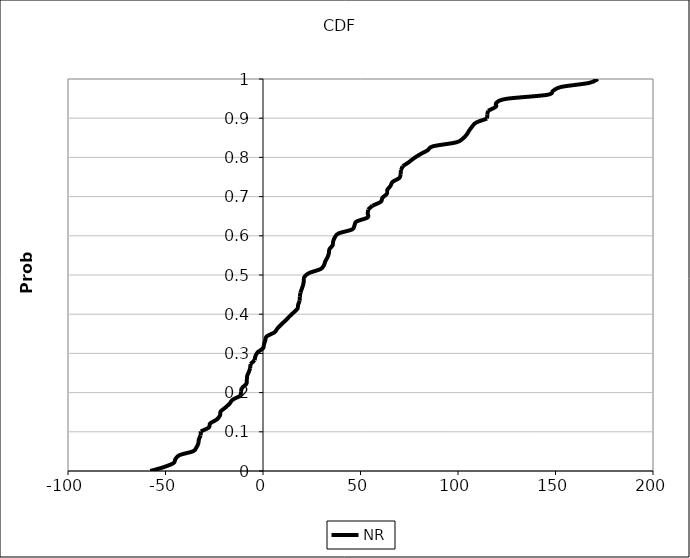
| Category | NR |
|---|---|
| -57.80231670845163 | 0 |
| -50.768704256658864 | 0.01 |
| -45.89005395207772 | 0.02 |
| -44.88699912563922 | 0.03 |
| -42.83760416756681 | 0.04 |
| -35.80107690244833 | 0.051 |
| -34.08795415145099 | 0.061 |
| -33.170313349035865 | 0.071 |
| -32.85676496140718 | 0.081 |
| -31.988054647058533 | 0.091 |
| -31.883796508712237 | 0.101 |
| -27.750935825503973 | 0.111 |
| -27.137139278713533 | 0.121 |
| -23.71871902504344 | 0.131 |
| -22.068456627165858 | 0.141 |
| -21.735996351500575 | 0.152 |
| -19.344555364196253 | 0.162 |
| -17.164370383557582 | 0.172 |
| -15.556686673689995 | 0.182 |
| -11.400345725125732 | 0.192 |
| -11.31280791130169 | 0.202 |
| -10.899704788500202 | 0.212 |
| -8.53740838362745 | 0.222 |
| -8.292044710777418 | 0.232 |
| -8.113612582367608 | 0.242 |
| -7.2853473468984475 | 0.253 |
| -6.534444747934344 | 0.263 |
| -6.428352315279767 | 0.273 |
| -4.2700662670837914 | 0.283 |
| -3.8866024050823 | 0.293 |
| -2.7022717595641836 | 0.303 |
| 0.013833679676281463 | 0.313 |
| 0.5207084772946473 | 0.323 |
| 1.1881976500699807 | 0.333 |
| 1.8792577445975667 | 0.343 |
| 5.843211174480388 | 0.354 |
| 7.407280895870855 | 0.364 |
| 9.324636957407648 | 0.374 |
| 11.544540646224448 | 0.384 |
| 13.498674381363656 | 0.394 |
| 15.642389859038502 | 0.404 |
| 17.675558598504608 | 0.414 |
| 18.023532332826164 | 0.424 |
| 18.840865235881836 | 0.434 |
| 18.89000572064299 | 0.444 |
| 19.172988759238933 | 0.455 |
| 19.88846547085575 | 0.465 |
| 20.58690533154771 | 0.475 |
| 20.930464330371763 | 0.485 |
| 21.19040562594327 | 0.495 |
| 23.620346942738735 | 0.505 |
| 29.542655897615333 | 0.515 |
| 31.260731827544674 | 0.525 |
| 31.984115072558126 | 0.535 |
| 33.093347683887345 | 0.545 |
| 33.77400788845452 | 0.556 |
| 34.06235298112847 | 0.566 |
| 35.680472831147085 | 0.576 |
| 35.99322262365982 | 0.586 |
| 36.835186557173074 | 0.596 |
| 38.72121885121328 | 0.606 |
| 45.69311638877963 | 0.616 |
| 46.90935505974943 | 0.626 |
| 47.92549956508816 | 0.636 |
| 53.53956777104699 | 0.646 |
| 53.73485746920065 | 0.657 |
| 53.84152552611755 | 0.667 |
| 56.08965080527997 | 0.677 |
| 60.42864812842154 | 0.687 |
| 61.24733836996106 | 0.697 |
| 63.49993588082555 | 0.707 |
| 63.75868305517926 | 0.717 |
| 65.37262262503685 | 0.727 |
| 66.4080860071389 | 0.737 |
| 69.89299357189188 | 0.747 |
| 70.61318461264887 | 0.758 |
| 70.74520972334395 | 0.768 |
| 71.69926628259395 | 0.778 |
| 74.80496344937404 | 0.788 |
| 77.43016224654679 | 0.798 |
| 80.65933589609452 | 0.808 |
| 84.42828966593731 | 0.818 |
| 87.12332937960812 | 0.828 |
| 99.10400128542682 | 0.838 |
| 102.60053683759088 | 0.848 |
| 104.50650048216235 | 0.859 |
| 105.74930778693826 | 0.869 |
| 107.26988353642074 | 0.879 |
| 109.33678515024235 | 0.889 |
| 114.92070728684203 | 0.899 |
| 114.97237643179145 | 0.909 |
| 115.4609881659025 | 0.919 |
| 119.4134698776169 | 0.929 |
| 119.70439516019235 | 0.939 |
| 124.9225936261582 | 0.949 |
| 145.7254356833035 | 0.96 |
| 148.70997743825933 | 0.97 |
| 152.91919955702662 | 0.98 |
| 167.12555493379935 | 0.99 |
| 171.8186704290144 | 1 |